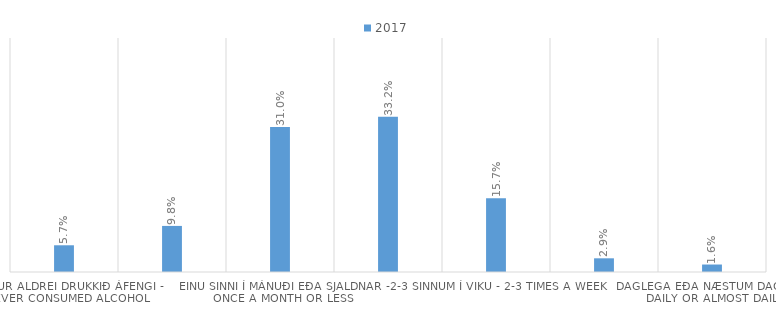
| Category | 2017 |
|---|---|
| Daglega eða næstum daglega - Daily or almost daily | 0.016 |
| 4-5 sinnum í viku - 4-5 times a week | 0.029 |
| 2-3 sinnum í viku - 2-3 times a week | 0.157 |
| 2-4 sinnum í mánuði - 2-4 times a month | 0.332 |
| Einu sinni í mánuði eða sjaldnar - Once a month or less | 0.31 |
| Aldrei á síðustu 12 mánuðum - Never in the last 12 months | 0.098 |
| Hef/ur aldrei drukkið áfengi - Never consumed alcohol | 0.057 |